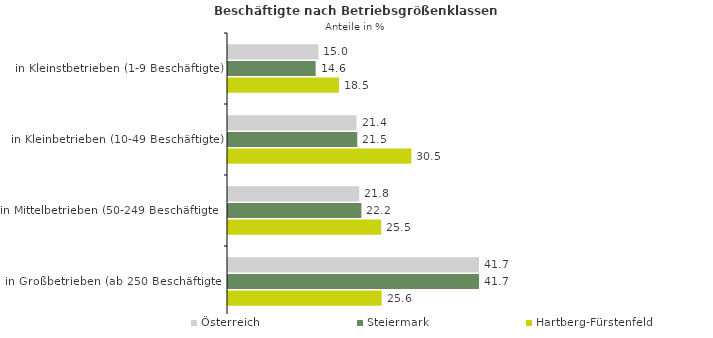
| Category | Österreich | Steiermark | Hartberg-Fürstenfeld |
|---|---|---|---|
| in Kleinstbetrieben (1-9 Beschäftigte) | 15.046 | 14.574 | 18.459 |
| in Kleinbetrieben (10-49 Beschäftigte) | 21.375 | 21.498 | 30.499 |
| in Mittelbetrieben (50-249 Beschäftigte) | 21.831 | 22.187 | 25.482 |
| in Großbetrieben (ab 250 Beschäftigte) | 41.748 | 41.742 | 25.56 |